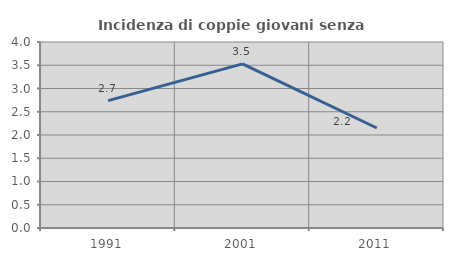
| Category | Incidenza di coppie giovani senza figli |
|---|---|
| 1991.0 | 2.74 |
| 2001.0 | 3.529 |
| 2011.0 | 2.151 |